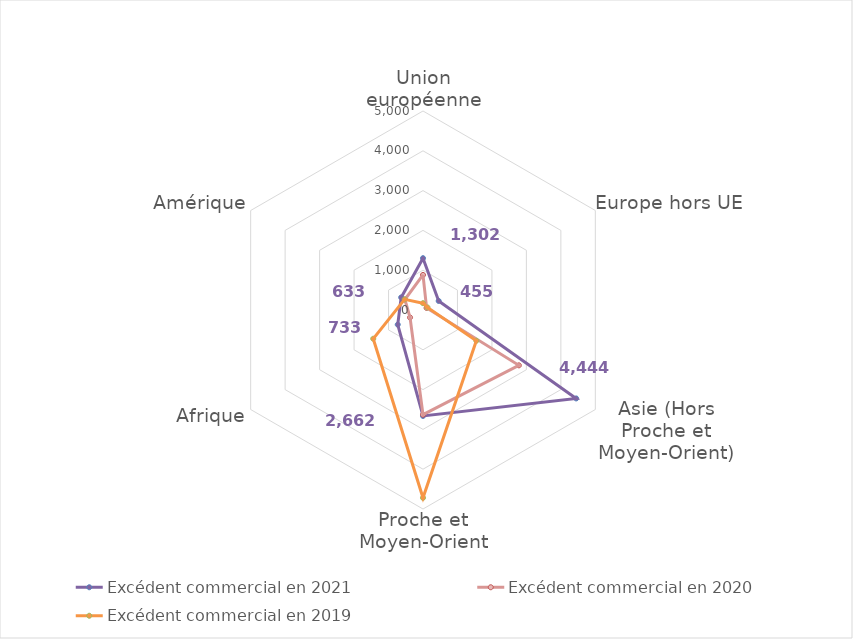
| Category | Excédent commercial en 2021 | Excédent commercial en 2020 | Excédent commercial en 2019 |
|---|---|---|---|
| Union européenne | 1302 | 881 | 171 |
| Europe hors UE | 455 | 104 | 130 |
| Asie (Hors Proche et Moyen-Orient) | 4444 | 2781 | 1547 |
| Proche et Moyen-Orient | 2662 | 2628 | 4719 |
| Afrique | 733 | 376 | 1444 |
| Amérique | 633 | 526 | 533 |